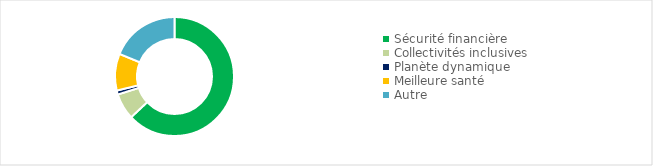
| Category | Series 0 |
|---|---|
| Sécurité financière | 0.63 |
| Collectivités inclusives | 0.071 |
| Planète dynamique | 0.011 |
| Meilleure santé | 0.1 |
| Autre | 0.188 |